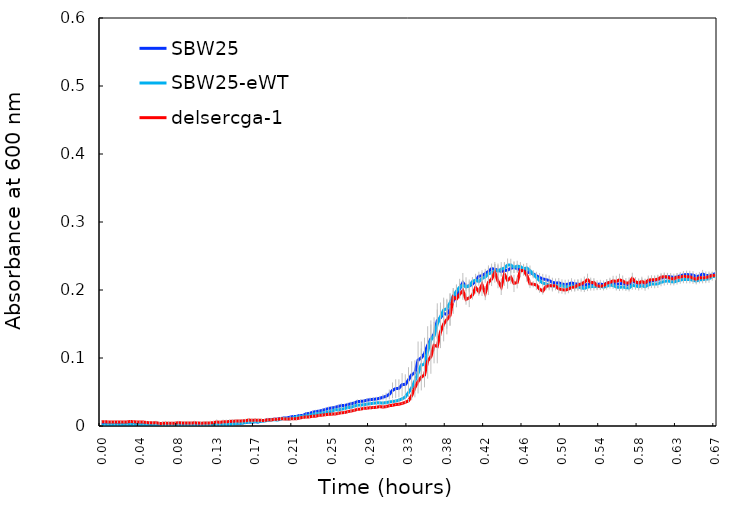
| Category | SBW25 | SBW25-eWT | delsercga-1 |
|---|---|---|---|
| 0.00010416666666666667 | 0.003 | 0.001 | 0.006 |
| 0.0035763888888888894 | 0.003 | 0.001 | 0.006 |
| 0.0070486111111111105 | 0.004 | 0.002 | 0.006 |
| 0.010520833333333333 | 0.004 | 0.002 | 0.006 |
| 0.013993055555555555 | 0.003 | 0.002 | 0.006 |
| 0.017465277777777777 | 0.004 | 0.002 | 0.006 |
| 0.020937499999999998 | 0.004 | 0.002 | 0.006 |
| 0.02440972222222222 | 0.005 | 0.003 | 0.006 |
| 0.027881944444444445 | 0.004 | 0.002 | 0.006 |
| 0.03135416666666666 | 0.005 | 0.003 | 0.007 |
| 0.034826388888888886 | 0.004 | 0.002 | 0.006 |
| 0.03829861111111111 | 0.005 | 0.003 | 0.006 |
| 0.04177083333333333 | 0.004 | 0.003 | 0.006 |
| 0.04524305555555556 | 0.005 | 0.003 | 0.006 |
| 0.04871527777777778 | 0.004 | 0.002 | 0.005 |
| 0.0521875 | 0.004 | 0.003 | 0.005 |
| 0.05565972222222223 | 0.003 | 0.002 | 0.005 |
| 0.059131944444444445 | 0.003 | 0.002 | 0.005 |
| 0.06260416666666667 | 0.002 | 0.003 | 0.004 |
| 0.06607638888888889 | 0.002 | 0.001 | 0.004 |
| 0.06954861111111112 | 0.002 | 0.001 | 0.004 |
| 0.07302083333333333 | 0.002 | 0.001 | 0.004 |
| 0.07649305555555556 | 0.002 | 0.001 | 0.004 |
| 0.07996527777777777 | 0.001 | 0.001 | 0.004 |
| 0.0834375 | 0.001 | 0.001 | 0.005 |
| 0.08690972222222222 | 0.001 | 0 | 0.004 |
| 0.09038194444444443 | 0.001 | 0 | 0.005 |
| 0.09385416666666667 | 0.001 | 0.001 | 0.005 |
| 0.09732638888888889 | 0 | 0 | 0.004 |
| 0.1007986111111111 | 0.001 | 0 | 0.005 |
| 0.10427083333333333 | 0 | 0 | 0.004 |
| 0.10774305555555556 | 0 | 0 | 0.004 |
| 0.11121527777777777 | 0 | 0 | 0.004 |
| 0.1146875 | 0 | 0.001 | 0.004 |
| 0.11815972222222222 | 0.001 | 0.001 | 0.005 |
| 0.12163194444444443 | 0.001 | 0.001 | 0.005 |
| 0.12510416666666666 | 0.002 | 0.002 | 0.006 |
| 0.1285763888888889 | 0.002 | 0.002 | 0.005 |
| 0.1320486111111111 | 0.003 | 0.002 | 0.006 |
| 0.13552083333333334 | 0.003 | 0.002 | 0.006 |
| 0.13899305555555555 | 0.004 | 0.002 | 0.007 |
| 0.14246527777777776 | 0.004 | 0.003 | 0.007 |
| 0.1459375 | 0.005 | 0.004 | 0.007 |
| 0.14940972222222224 | 0.004 | 0.004 | 0.007 |
| 0.15288194444444445 | 0.004 | 0.004 | 0.008 |
| 0.15635416666666666 | 0.005 | 0.005 | 0.008 |
| 0.1598263888888889 | 0.006 | 0.006 | 0.009 |
| 0.1632986111111111 | 0.006 | 0.006 | 0.008 |
| 0.16677083333333334 | 0.006 | 0.007 | 0.009 |
| 0.17024305555555555 | 0.006 | 0.006 | 0.008 |
| 0.17371527777777776 | 0.008 | 0.007 | 0.008 |
| 0.17718750000000003 | 0.008 | 0.007 | 0.008 |
| 0.18065972222222224 | 0.009 | 0.008 | 0.009 |
| 0.18413194444444445 | 0.01 | 0.009 | 0.009 |
| 0.18760416666666666 | 0.01 | 0.009 | 0.01 |
| 0.1910763888888889 | 0.01 | 0.009 | 0.01 |
| 0.1945486111111111 | 0.011 | 0.01 | 0.011 |
| 0.1980208333333333 | 0.012 | 0.011 | 0.01 |
| 0.20149305555555555 | 0.012 | 0.01 | 0.01 |
| 0.20496527777777776 | 0.013 | 0.011 | 0.01 |
| 0.20843750000000003 | 0.014 | 0.012 | 0.011 |
| 0.21190972222222224 | 0.014 | 0.013 | 0.011 |
| 0.21538194444444445 | 0.016 | 0.014 | 0.012 |
| 0.21885416666666668 | 0.016 | 0.014 | 0.013 |
| 0.2223263888888889 | 0.018 | 0.015 | 0.013 |
| 0.2257986111111111 | 0.018 | 0.016 | 0.013 |
| 0.2292708333333333 | 0.02 | 0.017 | 0.014 |
| 0.23274305555555555 | 0.021 | 0.018 | 0.014 |
| 0.23621527777777776 | 0.022 | 0.018 | 0.016 |
| 0.23968749999999997 | 0.023 | 0.019 | 0.016 |
| 0.24315972222222224 | 0.024 | 0.02 | 0.017 |
| 0.24663194444444445 | 0.026 | 0.021 | 0.017 |
| 0.2501041666666667 | 0.027 | 0.021 | 0.017 |
| 0.2535763888888889 | 0.027 | 0.024 | 0.018 |
| 0.2570486111111111 | 0.029 | 0.024 | 0.018 |
| 0.26052083333333337 | 0.03 | 0.025 | 0.02 |
| 0.2639930555555556 | 0.03 | 0.026 | 0.02 |
| 0.2674652777777778 | 0.031 | 0.027 | 0.021 |
| 0.27092592592592596 | 0.033 | 0.027 | 0.022 |
| 0.2744097222222222 | 0.034 | 0.029 | 0.023 |
| 0.2778819444444444 | 0.036 | 0.031 | 0.025 |
| 0.2813541666666666 | 0.036 | 0.031 | 0.025 |
| 0.2848263888888889 | 0.037 | 0.031 | 0.026 |
| 0.2882986111111111 | 0.038 | 0.032 | 0.026 |
| 0.29177083333333337 | 0.039 | 0.033 | 0.027 |
| 0.2952430555555556 | 0.039 | 0.033 | 0.027 |
| 0.2987152777777778 | 0.04 | 0.034 | 0.028 |
| 0.3021875 | 0.041 | 0.034 | 0.029 |
| 0.3056597222222222 | 0.042 | 0.034 | 0.028 |
| 0.3091319444444444 | 0.044 | 0.034 | 0.028 |
| 0.3126041666666666 | 0.047 | 0.035 | 0.03 |
| 0.3160763888888889 | 0.052 | 0.036 | 0.03 |
| 0.3195486111111111 | 0.055 | 0.037 | 0.032 |
| 0.3230208333333333 | 0.055 | 0.038 | 0.032 |
| 0.3264930555555556 | 0.061 | 0.04 | 0.033 |
| 0.3299652777777778 | 0.061 | 0.043 | 0.035 |
| 0.3334375 | 0.068 | 0.049 | 0.037 |
| 0.3369097222222222 | 0.075 | 0.056 | 0.045 |
| 0.3403819444444445 | 0.078 | 0.066 | 0.056 |
| 0.3438541666666666 | 0.097 | 0.078 | 0.066 |
| 0.3473263888888889 | 0.1 | 0.09 | 0.072 |
| 0.35079861111111116 | 0.106 | 0.09 | 0.075 |
| 0.3542708333333333 | 0.119 | 0.11 | 0.096 |
| 0.3577430555555556 | 0.128 | 0.127 | 0.102 |
| 0.3612152777777778 | 0.135 | 0.132 | 0.119 |
| 0.3646875 | 0.155 | 0.15 | 0.117 |
| 0.3681597222222222 | 0.159 | 0.161 | 0.138 |
| 0.3716319444444445 | 0.166 | 0.171 | 0.15 |
| 0.3751041666666666 | 0.164 | 0.172 | 0.156 |
| 0.3785763888888889 | 0.172 | 0.181 | 0.162 |
| 0.38204861111111116 | 0.184 | 0.192 | 0.19 |
| 0.3855208333333333 | 0.191 | 0.198 | 0.187 |
| 0.3889930555555556 | 0.202 | 0.204 | 0.194 |
| 0.3924652777777778 | 0.211 | 0.207 | 0.199 |
| 0.3959375 | 0.205 | 0.204 | 0.186 |
| 0.3994097222222222 | 0.206 | 0.206 | 0.188 |
| 0.4028819444444445 | 0.209 | 0.212 | 0.192 |
| 0.4063541666666666 | 0.214 | 0.215 | 0.204 |
| 0.4098263888888889 | 0.22 | 0.212 | 0.198 |
| 0.41329861111111116 | 0.221 | 0.217 | 0.208 |
| 0.4167708333333333 | 0.224 | 0.219 | 0.195 |
| 0.4202430555555556 | 0.227 | 0.224 | 0.211 |
| 0.4237152777777778 | 0.231 | 0.225 | 0.216 |
| 0.4271875 | 0.23 | 0.228 | 0.226 |
| 0.4306597222222222 | 0.229 | 0.228 | 0.213 |
| 0.4341319444444445 | 0.227 | 0.231 | 0.205 |
| 0.4376041666666666 | 0.229 | 0.232 | 0.223 |
| 0.4410763888888889 | 0.229 | 0.237 | 0.214 |
| 0.44454861111111116 | 0.232 | 0.237 | 0.219 |
| 0.4480208333333333 | 0.233 | 0.233 | 0.21 |
| 0.4514930555555556 | 0.231 | 0.235 | 0.211 |
| 0.4549652777777778 | 0.23 | 0.234 | 0.229 |
| 0.4584375 | 0.232 | 0.231 | 0.228 |
| 0.4619097222222222 | 0.226 | 0.232 | 0.222 |
| 0.4653819444444445 | 0.226 | 0.229 | 0.209 |
| 0.4688541666666666 | 0.224 | 0.223 | 0.209 |
| 0.4723263888888889 | 0.221 | 0.219 | 0.207 |
| 0.47579861111111116 | 0.218 | 0.214 | 0.201 |
| 0.4792708333333333 | 0.216 | 0.21 | 0.198 |
| 0.4827430555555556 | 0.215 | 0.209 | 0.205 |
| 0.4862152777777778 | 0.214 | 0.207 | 0.206 |
| 0.4896875 | 0.211 | 0.206 | 0.206 |
| 0.4931597222222222 | 0.21 | 0.206 | 0.206 |
| 0.4966319444444445 | 0.211 | 0.206 | 0.202 |
| 0.5001041666666667 | 0.209 | 0.206 | 0.201 |
| 0.5035763888888889 | 0.208 | 0.205 | 0.2 |
| 0.5070486111111111 | 0.209 | 0.204 | 0.201 |
| 0.5105208333333333 | 0.21 | 0.206 | 0.204 |
| 0.5139930555555555 | 0.209 | 0.205 | 0.204 |
| 0.5174652777777778 | 0.209 | 0.205 | 0.207 |
| 0.5209374999999999 | 0.207 | 0.203 | 0.209 |
| 0.5244097222222223 | 0.207 | 0.202 | 0.211 |
| 0.5278819444444445 | 0.208 | 0.204 | 0.215 |
| 0.5313541666666667 | 0.209 | 0.205 | 0.211 |
| 0.5348263888888889 | 0.209 | 0.205 | 0.211 |
| 0.5382986111111111 | 0.208 | 0.205 | 0.206 |
| 0.5417708333333333 | 0.209 | 0.206 | 0.205 |
| 0.5452430555555555 | 0.208 | 0.204 | 0.206 |
| 0.5487152777777778 | 0.21 | 0.206 | 0.21 |
| 0.5521874999999999 | 0.211 | 0.207 | 0.211 |
| 0.5556597222222223 | 0.211 | 0.207 | 0.213 |
| 0.5591319444444445 | 0.209 | 0.204 | 0.213 |
| 0.5626041666666667 | 0.209 | 0.204 | 0.215 |
| 0.5660763888888889 | 0.21 | 0.205 | 0.213 |
| 0.5695486111111111 | 0.208 | 0.203 | 0.21 |
| 0.5730208333333333 | 0.208 | 0.203 | 0.21 |
| 0.5764930555555555 | 0.212 | 0.207 | 0.217 |
| 0.5799652777777778 | 0.211 | 0.206 | 0.212 |
| 0.5834374999999999 | 0.209 | 0.205 | 0.21 |
| 0.5869097222222223 | 0.211 | 0.206 | 0.213 |
| 0.5903819444444445 | 0.209 | 0.205 | 0.21 |
| 0.5938541666666667 | 0.211 | 0.207 | 0.214 |
| 0.5973263888888889 | 0.214 | 0.209 | 0.215 |
| 0.6007986111111111 | 0.214 | 0.209 | 0.215 |
| 0.6042708333333333 | 0.215 | 0.209 | 0.216 |
| 0.6077430555555555 | 0.217 | 0.211 | 0.219 |
| 0.6112152777777778 | 0.218 | 0.213 | 0.22 |
| 0.6146874999999999 | 0.219 | 0.213 | 0.219 |
| 0.6181597222222223 | 0.219 | 0.212 | 0.217 |
| 0.6216319444444445 | 0.218 | 0.212 | 0.216 |
| 0.6251041666666667 | 0.219 | 0.213 | 0.219 |
| 0.6285763888888889 | 0.221 | 0.215 | 0.219 |
| 0.6320486111111111 | 0.222 | 0.216 | 0.22 |
| 0.6355208333333333 | 0.223 | 0.215 | 0.22 |
| 0.6389930555555555 | 0.222 | 0.215 | 0.22 |
| 0.6424652777777778 | 0.222 | 0.214 | 0.217 |
| 0.6459374999999999 | 0.22 | 0.213 | 0.216 |
| 0.6494097222222223 | 0.221 | 0.215 | 0.218 |
| 0.6528819444444445 | 0.224 | 0.215 | 0.218 |
| 0.6563541666666667 | 0.221 | 0.216 | 0.218 |
| 0.6598263888888889 | 0.221 | 0.217 | 0.219 |
| 0.6632986111111111 | 0.222 | 0.22 | 0.221 |
| 0.6667708333333334 | 0.224 | 0.22 | 0.221 |